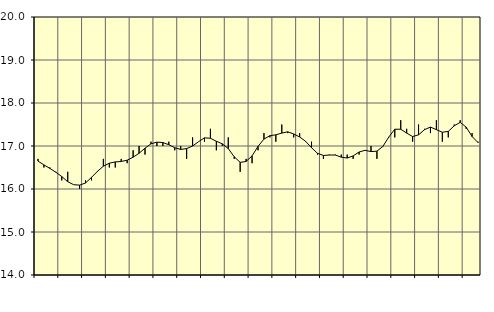
| Category | Piggar | Handel, SNI 45-47 |
|---|---|---|
| nan | 16.7 | 16.65 |
| 1.0 | 16.5 | 16.56 |
| 1.0 | 16.5 | 16.48 |
| 1.0 | 16.4 | 16.39 |
| nan | 16.2 | 16.29 |
| 2.0 | 16.4 | 16.17 |
| 2.0 | 16.1 | 16.1 |
| 2.0 | 16 | 16.09 |
| nan | 16.2 | 16.14 |
| 3.0 | 16.2 | 16.27 |
| 3.0 | 16.4 | 16.41 |
| 3.0 | 16.7 | 16.53 |
| nan | 16.5 | 16.6 |
| 4.0 | 16.5 | 16.63 |
| 4.0 | 16.7 | 16.64 |
| 4.0 | 16.6 | 16.67 |
| nan | 16.9 | 16.74 |
| 5.0 | 17 | 16.83 |
| 5.0 | 16.8 | 16.95 |
| 5.0 | 17.1 | 17.05 |
| nan | 17 | 17.09 |
| 6.0 | 17 | 17.08 |
| 6.0 | 17.1 | 17.03 |
| 6.0 | 16.9 | 16.96 |
| nan | 17 | 16.92 |
| 7.0 | 16.7 | 16.94 |
| 7.0 | 17.2 | 17 |
| 7.0 | 17.1 | 17.1 |
| nan | 17.1 | 17.19 |
| 8.0 | 17.4 | 17.18 |
| 8.0 | 16.9 | 17.11 |
| 8.0 | 17 | 17.05 |
| nan | 17.2 | 16.94 |
| 9.0 | 16.7 | 16.75 |
| 9.0 | 16.4 | 16.62 |
| 9.0 | 16.7 | 16.64 |
| nan | 16.6 | 16.77 |
| 10.0 | 16.9 | 16.99 |
| 10.0 | 17.3 | 17.16 |
| 10.0 | 17.2 | 17.24 |
| nan | 17.1 | 17.26 |
| 11.0 | 17.5 | 17.3 |
| 11.0 | 17.3 | 17.33 |
| 11.0 | 17.2 | 17.28 |
| nan | 17.3 | 17.21 |
| 12.0 | 17.1 | 17.11 |
| 12.0 | 17.1 | 16.96 |
| 12.0 | 16.8 | 16.83 |
| nan | 16.7 | 16.78 |
| 13.0 | 16.8 | 16.79 |
| 13.0 | 16.8 | 16.79 |
| 13.0 | 16.8 | 16.74 |
| nan | 16.8 | 16.72 |
| 14.0 | 16.7 | 16.77 |
| 14.0 | 16.8 | 16.86 |
| 14.0 | 16.9 | 16.9 |
| nan | 17 | 16.87 |
| 15.0 | 16.7 | 16.88 |
| 15.0 | 17 | 16.99 |
| 15.0 | 17.2 | 17.21 |
| nan | 17.2 | 17.39 |
| 16.0 | 17.6 | 17.39 |
| 16.0 | 17.4 | 17.3 |
| 16.0 | 17.1 | 17.22 |
| nan | 17.5 | 17.26 |
| 17.0 | 17.4 | 17.38 |
| 17.0 | 17.3 | 17.44 |
| 17.0 | 17.6 | 17.38 |
| nan | 17.1 | 17.32 |
| 18.0 | 17.2 | 17.34 |
| 18.0 | 17.5 | 17.47 |
| 18.0 | 17.6 | 17.55 |
| nan | 17.4 | 17.44 |
| 19.0 | 17.3 | 17.22 |
| 19.0 | 17.1 | 17.08 |